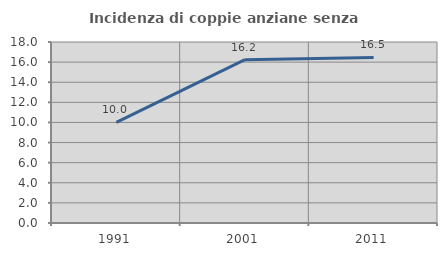
| Category | Incidenza di coppie anziane senza figli  |
|---|---|
| 1991.0 | 10 |
| 2001.0 | 16.245 |
| 2011.0 | 16.461 |